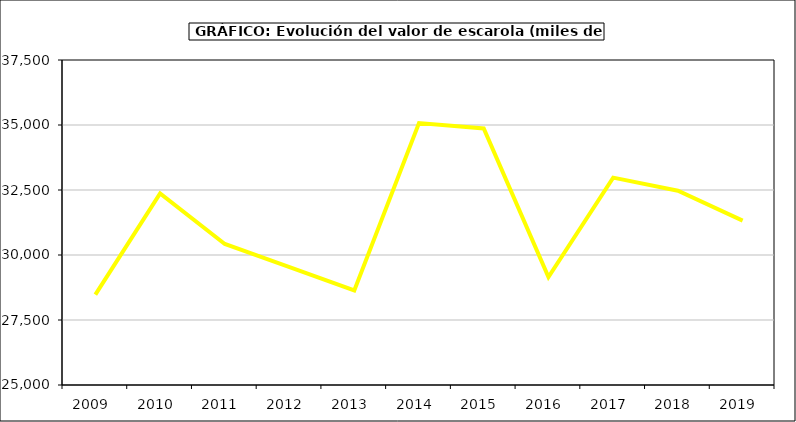
| Category | Valor |
|---|---|
| 2009.0 | 28477.33 |
| 2010.0 | 32371.364 |
| 2011.0 | 30423.163 |
| 2012.0 | 29537.457 |
| 2013.0 | 28639.256 |
| 2014.0 | 35074.052 |
| 2015.0 | 34867 |
| 2016.0 | 29152 |
| 2017.0 | 32975.446 |
| 2018.0 | 32472.175 |
| 2019.0 | 31324.351 |